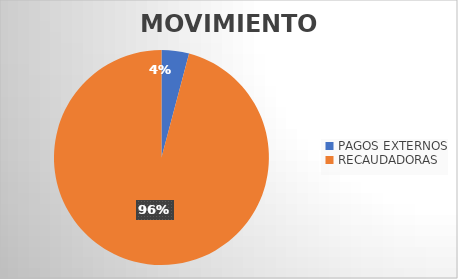
| Category | MOVIMIENTOS |
|---|---|
| PAGOS EXTERNOS | 863 |
| RECAUDADORAS | 20023 |